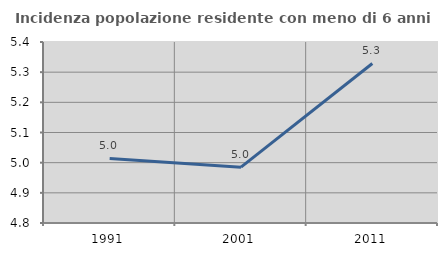
| Category | Incidenza popolazione residente con meno di 6 anni |
|---|---|
| 1991.0 | 5.014 |
| 2001.0 | 4.985 |
| 2011.0 | 5.329 |